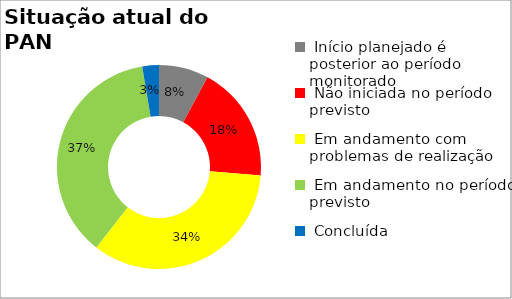
| Category | Series 0 |
|---|---|
|  Início planejado é posterior ao período monitorado | 0.079 |
|  Não iniciada no período previsto | 0.184 |
|  Em andamento com problemas de realização | 0.342 |
|  Em andamento no período previsto  | 0.368 |
|  Concluída | 0.026 |